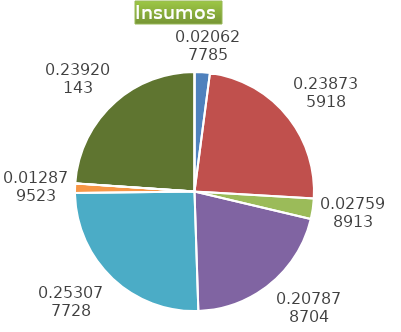
| Category | Series 0 |
|---|---|
| Control arvenses | 2085636 |
| Control fitosanitario | 24138133 |
| Cosecha y beneficio | 2790473.376 |
| Fertilización | 21018219 |
| Instalación | 25588206 |
| Otros | 1302224 |
| Podas | 0 |
| Riego | 0 |
| Transporte | 24185200 |
| Tutorado | 0 |